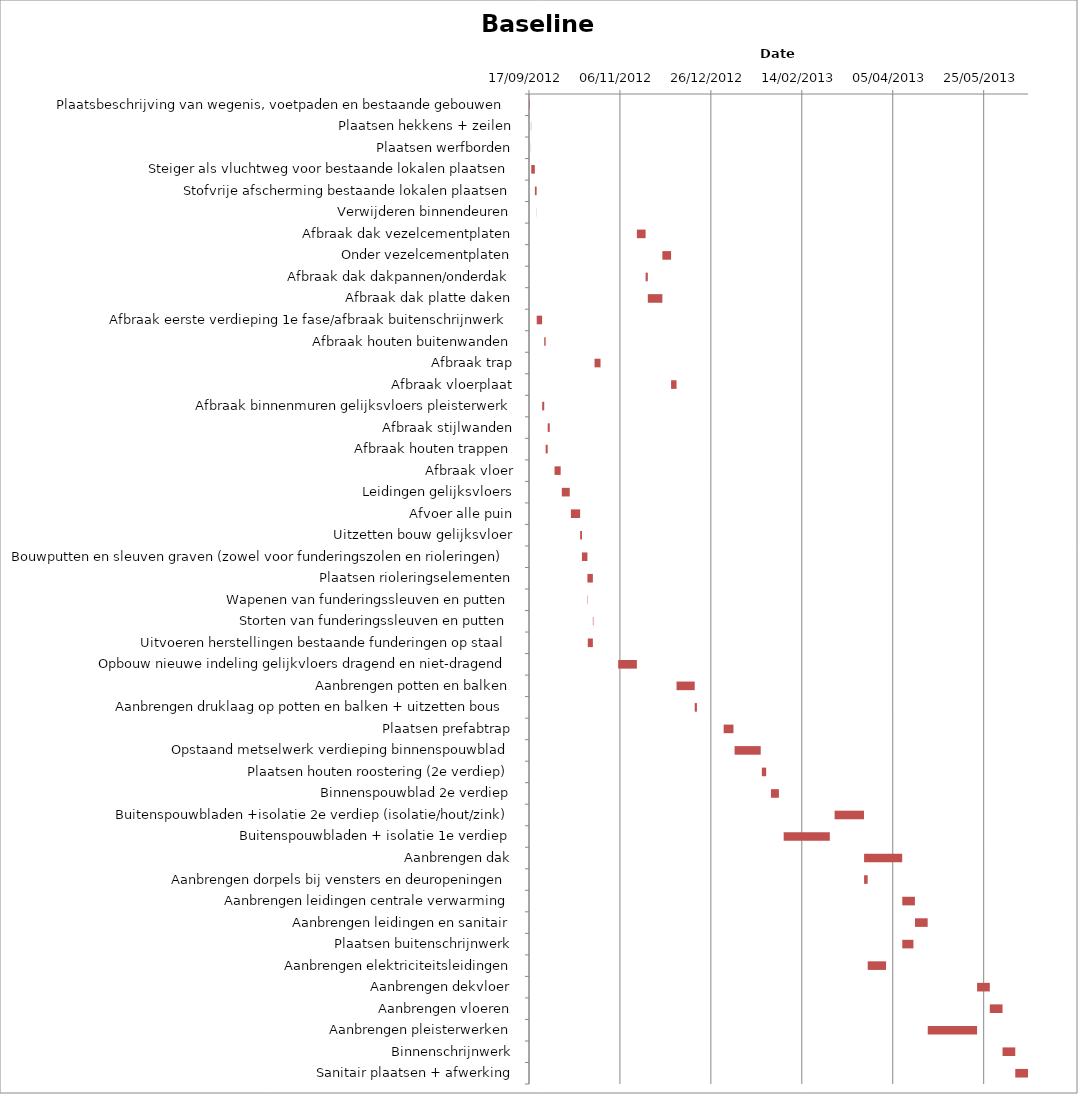
| Category | Baseline start | Actual duration |
|---|---|---|
| Plaatsbeschrijving van wegenis, voetpaden en bestaande gebouwen | 41169.333 | 0.375 |
| Plaatsen hekkens + zeilen | 41170.333 | 0.167 |
| Plaatsen werfborden | 41170.333 | 0.083 |
| Steiger als vluchtweg voor bestaande lokalen plaatsen | 41170.542 | 1.958 |
| Stofvrije afscherming bestaande lokalen plaatsen | 41172.542 | 0.958 |
| Verwijderen binnendeuren | 41173.542 | 0.083 |
| Afbraak dak vezelcementplaten | 41228.625 | 4.792 |
| Onder vezelcementplaten | 41242.625 | 4.792 |
| Afbraak dak dakpannen/onderdak | 41233.417 | 1.208 |
| Afbraak dak platte daken | 41234.625 | 8 |
| Afbraak eerste verdieping 1e fase/afbraak buitenschrijnwerk | 41173.542 | 2.958 |
| Afbraak houten buitenwanden | 41177.667 | 0.792 |
| Afbraak trap | 41205.333 | 3.292 |
| Afbraak vloerplaat | 41247.417 | 3 |
| Afbraak binnenmuren gelijksvloers pleisterwerk | 41176.542 | 1.125 |
| Afbraak stijlwanden | 41179.583 | 1.125 |
| Afbraak houten trappen | 41178.458 | 1.125 |
| Afbraak vloer | 41183.333 | 3.375 |
| Leidingen gelijksvloers | 41187.333 | 4.375 |
| Afvoer alle puin | 41192.333 | 5.083 |
| Uitzetten bouw gelijksvloer | 41197.417 | 1 |
| Bouwputten en sleuven graven (zowel voor funderingszolen en rioleringen) | 41198.417 | 3 |
| Plaatsen rioleringselementen | 41201.417 | 3 |
| Wapenen van funderingssleuven en putten | 41201.417 | 0.208 |
| Storten van funderingssleuven en putten | 41204.417 | 0.292 |
| Uitvoeren herstellingen bestaande funderingen op staal | 41201.625 | 2.792 |
| Opbouw nieuwe indeling gelijkvloers dragend en niet-dragend | 41218.333 | 10.292 |
| Aanbrengen potten en balken | 41250.417 | 10 |
| Aanbrengen druklaag op potten en balken + uitzetten bous | 41260.417 | 1.208 |
| Plaatsen prefabtrap | 41276.333 | 5.375 |
| Opstaand metselwerk verdieping binnenspouwblad | 41282.333 | 14.375 |
| Plaatsen houten roostering (2e verdiep) | 41297.333 | 2.375 |
| Binnenspouwblad 2e verdiep | 41302.333 | 4.375 |
| Buitenspouwbladen +isolatie 2e verdiep (isolatie/hout/zink) | 41337.333 | 16.167 |
| Buitenspouwbladen + isolatie 1e verdiep | 41309.333 | 25.375 |
| Aanbrengen dak | 41353.542 | 20.958 |
| Aanbrengen dorpels bij vensters en deuropeningen | 41353.542 | 1.958 |
| Aanbrengen leidingen centrale verwarming | 41374.542 | 6.958 |
| Aanbrengen leidingen en sanitair | 41381.542 | 6.958 |
| Plaatsen buitenschrijnwerk | 41374.542 | 6.125 |
| Aanbrengen elektriciteitsleidingen | 41355.542 | 10.083 |
| Aanbrengen dekvloer | 41415.667 | 7 |
| Aanbrengen vloeren | 41422.667 | 7 |
| Aanbrengen pleisterwerken | 41388.542 | 27.125 |
| Binnenschrijnwerk | 41429.667 | 7 |
| Sanitair plaatsen + afwerking | 41436.667 | 7 |